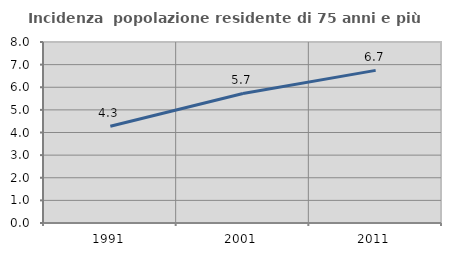
| Category | Incidenza  popolazione residente di 75 anni e più |
|---|---|
| 1991.0 | 4.278 |
| 2001.0 | 5.726 |
| 2011.0 | 6.746 |